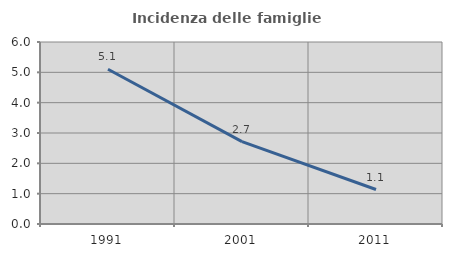
| Category | Incidenza delle famiglie numerose |
|---|---|
| 1991.0 | 5.1 |
| 2001.0 | 2.714 |
| 2011.0 | 1.136 |